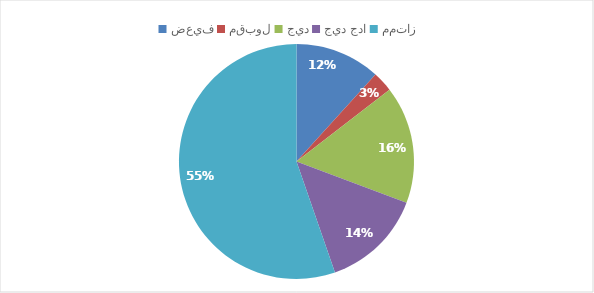
| Category | Series 0 |
|---|---|
| ضعيف | 21 |
| مقبول | 5 |
| جيد | 29 |
| جيد جدا | 25 |
| ممتاز | 99 |